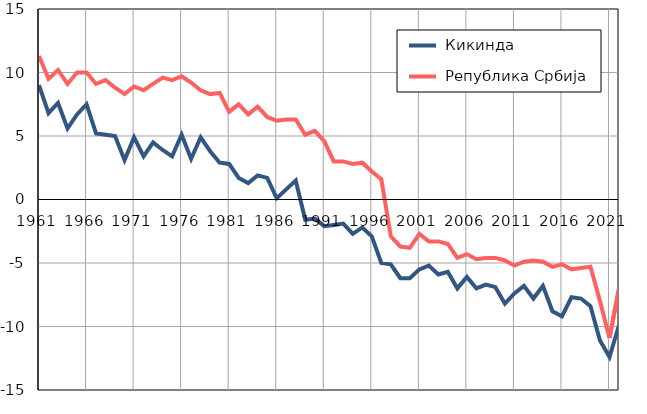
| Category |  Кикинда |  Република Србија |
|---|---|---|
| 1961.0 | 9 | 11.3 |
| 1962.0 | 6.8 | 9.5 |
| 1963.0 | 7.6 | 10.2 |
| 1964.0 | 5.6 | 9.1 |
| 1965.0 | 6.7 | 10 |
| 1966.0 | 7.5 | 10 |
| 1967.0 | 5.2 | 9.1 |
| 1968.0 | 5.1 | 9.4 |
| 1969.0 | 5 | 8.8 |
| 1970.0 | 3.1 | 8.3 |
| 1971.0 | 4.9 | 8.9 |
| 1972.0 | 3.4 | 8.6 |
| 1973.0 | 4.5 | 9.1 |
| 1974.0 | 3.9 | 9.6 |
| 1975.0 | 3.4 | 9.4 |
| 1976.0 | 5.1 | 9.7 |
| 1977.0 | 3.2 | 9.2 |
| 1978.0 | 4.9 | 8.6 |
| 1979.0 | 3.8 | 8.3 |
| 1980.0 | 2.9 | 8.4 |
| 1981.0 | 2.8 | 6.9 |
| 1982.0 | 1.7 | 7.5 |
| 1983.0 | 1.3 | 6.7 |
| 1984.0 | 1.9 | 7.3 |
| 1985.0 | 1.7 | 6.5 |
| 1986.0 | 0.1 | 6.2 |
| 1987.0 | 0.8 | 6.3 |
| 1988.0 | 1.5 | 6.3 |
| 1989.0 | -1.6 | 5.1 |
| 1990.0 | -1.5 | 5.4 |
| 1991.0 | -2.1 | 4.6 |
| 1992.0 | -2 | 3 |
| 1993.0 | -1.9 | 3 |
| 1994.0 | -2.7 | 2.8 |
| 1995.0 | -2.2 | 2.9 |
| 1996.0 | -2.9 | 2.2 |
| 1997.0 | -5 | 1.6 |
| 1998.0 | -5.1 | -2.9 |
| 1999.0 | -6.2 | -3.7 |
| 2000.0 | -6.2 | -3.8 |
| 2001.0 | -5.5 | -2.7 |
| 2002.0 | -5.2 | -3.3 |
| 2003.0 | -5.9 | -3.3 |
| 2004.0 | -5.7 | -3.5 |
| 2005.0 | -7 | -4.6 |
| 2006.0 | -6.1 | -4.3 |
| 2007.0 | -7 | -4.7 |
| 2008.0 | -6.7 | -4.6 |
| 2009.0 | -6.9 | -4.6 |
| 2010.0 | -8.2 | -4.8 |
| 2011.0 | -7.4 | -5.2 |
| 2012.0 | -6.8 | -4.9 |
| 2013.0 | -7.8 | -4.8 |
| 2014.0 | -6.8 | -4.9 |
| 2015.0 | -8.8 | -5.3 |
| 2016.0 | -9.2 | -5.1 |
| 2017.0 | -7.7 | -5.5 |
| 2018.0 | -7.8 | -5.4 |
| 2019.0 | -8.4 | -5.3 |
| 2020.0 | -11.1 | -8 |
| 2021.0 | -12.4 | -10.9 |
| 2022.0 | -9.9 | -7 |